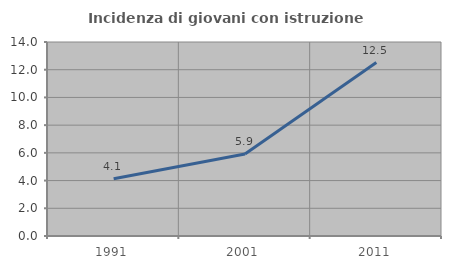
| Category | Incidenza di giovani con istruzione universitaria |
|---|---|
| 1991.0 | 4.131 |
| 2001.0 | 5.917 |
| 2011.0 | 12.519 |